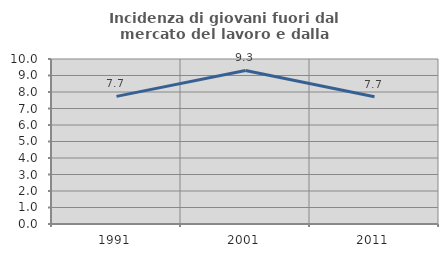
| Category | Incidenza di giovani fuori dal mercato del lavoro e dalla formazione  |
|---|---|
| 1991.0 | 7.733 |
| 2001.0 | 9.309 |
| 2011.0 | 7.715 |